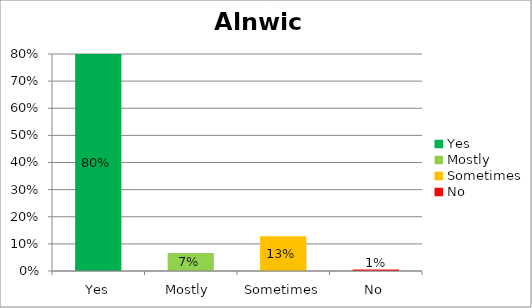
| Category | Alnwick |
|---|---|
| Yes | 0.8 |
| Mostly  | 0.067 |
| Sometimes | 0.128 |
| No | 0.005 |